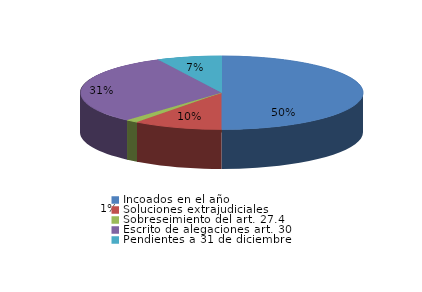
| Category | Series 0 |
|---|---|
| Incoados en el año | 427 |
| Soluciones extrajudiciales | 87 |
| Sobreseimiento del art. 27.4 | 12 |
| Escrito de alegaciones art. 30 | 265 |
| Pendientes a 31 de diciembre | 63 |